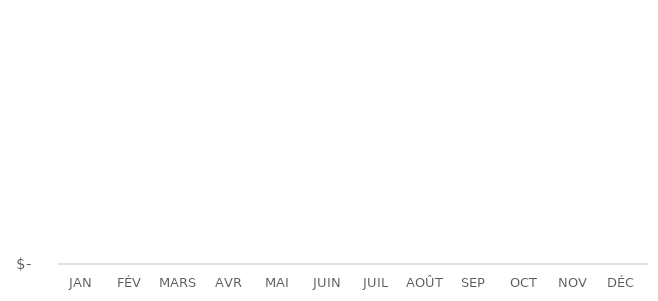
| Category | Series 0 |
|---|---|
| JAN | 0 |
| FÉV | 0 |
| MARS | 0 |
| AVR | 0 |
| MAI | 0 |
| JUIN | 0 |
| JUIL | 0 |
| AOÛT | 0 |
| SEP | 0 |
| OCT | 0 |
| NOV | 0 |
| DÉC | 0 |